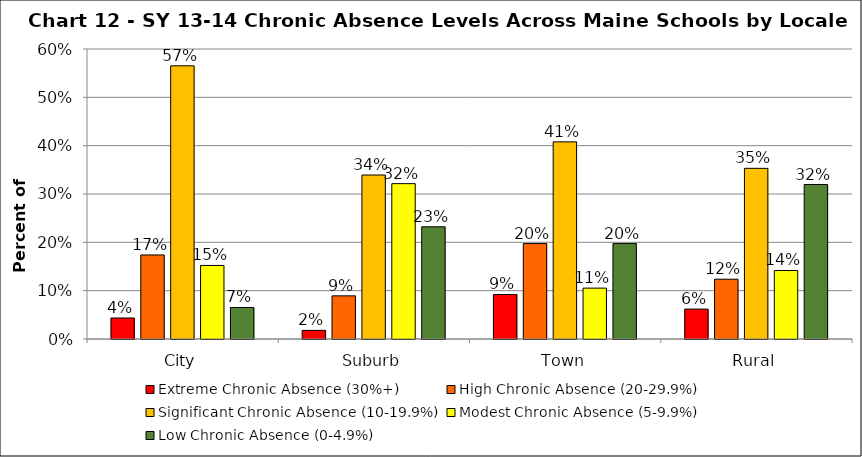
| Category | Extreme Chronic Absence (30%+) | High Chronic Absence (20-29.9%) | Significant Chronic Absence (10-19.9%) | Modest Chronic Absence (5-9.9%) | Low Chronic Absence (0-4.9%) |
|---|---|---|---|---|---|
| 0 | 0.043 | 0.174 | 0.565 | 0.152 | 0.065 |
| 1 | 0.018 | 0.089 | 0.339 | 0.321 | 0.232 |
| 2 | 0.092 | 0.197 | 0.408 | 0.105 | 0.197 |
| 3 | 0.062 | 0.124 | 0.353 | 0.142 | 0.32 |